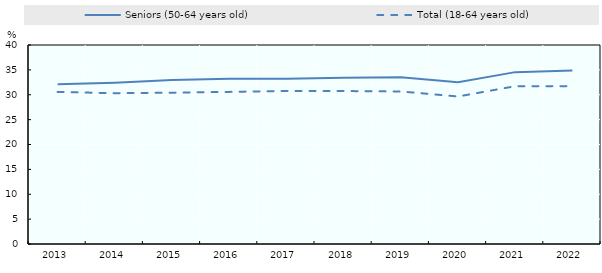
| Category | Seniors (50-64 years old) | Total (18-64 years old) |
|---|---|---|
| 2013 | 32.106 | 30.575 |
| 2014 | 32.426 | 30.305 |
| 2015 | 32.968 | 30.414 |
| 2016 | 33.227 | 30.576 |
| 2017 | 33.232 | 30.765 |
| 2018 | 33.436 | 30.744 |
| 2019 | 33.534 | 30.662 |
| 2020 | 32.501 | 29.65 |
| 2021 | 34.547 | 31.717 |
| 2022 | 34.881 | 31.723 |